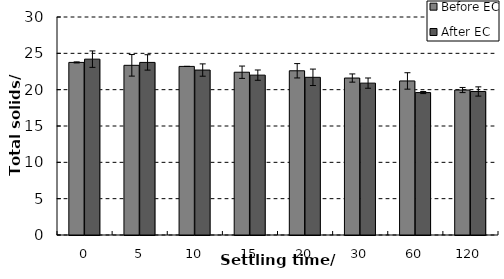
| Category | Before EC | After EC |
|---|---|---|
| 0.0 | 23.75 | 24.2 |
| 5.0 | 23.35 | 23.75 |
| 10.0 | 23.2 | 22.7 |
| 15.0 | 22.4 | 22 |
| 20.0 | 22.6 | 21.7 |
| 30.0 | 21.6 | 20.9 |
| 60.0 | 21.2 | 19.6 |
| 120.0 | 19.95 | 19.75 |